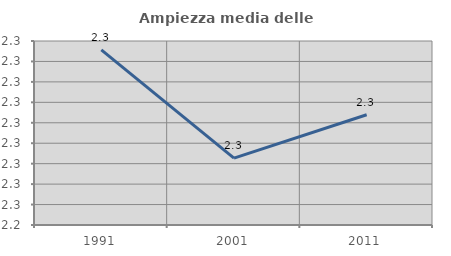
| Category | Ampiezza media delle famiglie |
|---|---|
| 1991.0 | 2.326 |
| 2001.0 | 2.273 |
| 2011.0 | 2.294 |